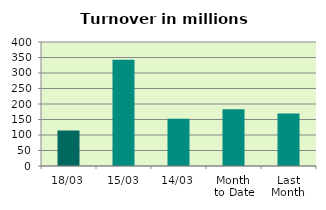
| Category | Series 0 |
|---|---|
| 18/03 | 114.492 |
| 15/03 | 342.561 |
| 14/03 | 152.775 |
| Month 
to Date | 182.914 |
| Last
Month | 168.971 |